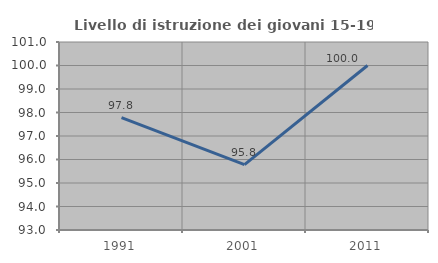
| Category | Livello di istruzione dei giovani 15-19 anni |
|---|---|
| 1991.0 | 97.786 |
| 2001.0 | 95.783 |
| 2011.0 | 100 |